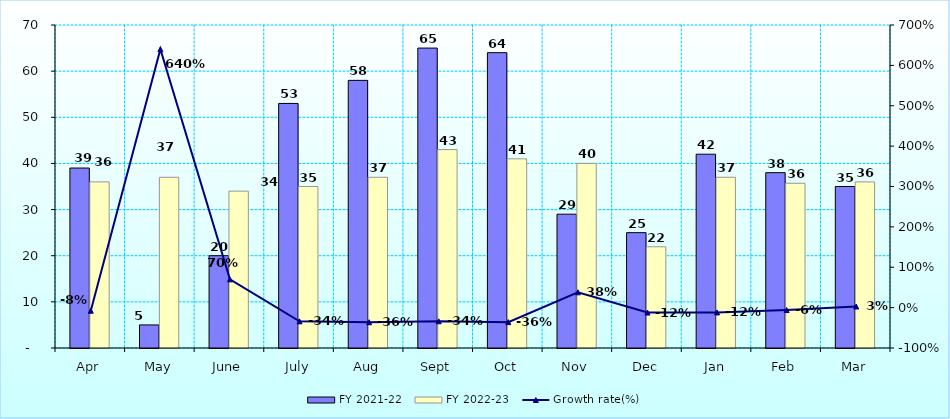
| Category | FY 2021-22 | FY 2022-23 |
|---|---|---|
| Apr | 39 | 36 |
| May | 5 | 37 |
| June | 20 | 34 |
| July | 53 | 35 |
| Aug | 58 | 37 |
| Sept | 65 | 43 |
| Oct | 64 | 41 |
| Nov | 29 | 40 |
| Dec | 25 | 21.934 |
| Jan | 42 | 37 |
| Feb | 38 | 35.706 |
| Mar | 35 | 36 |